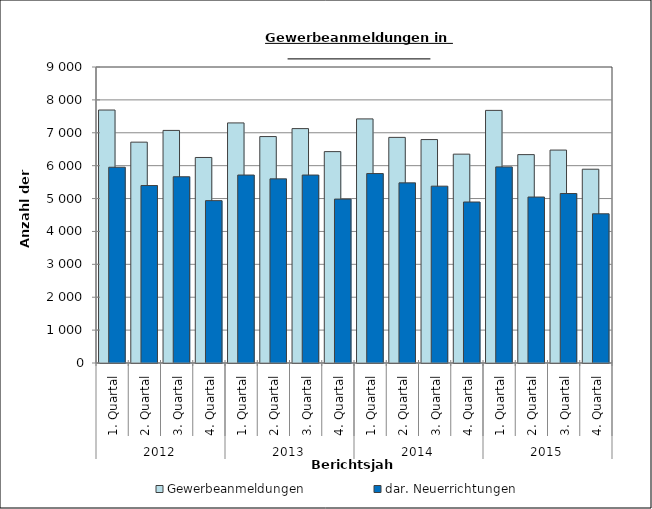
| Category | Gewerbeanmeldungen | dar. Neuerrichtungen |
|---|---|---|
| 0 | 7692 | 5952 |
| 1 | 6715 | 5396 |
| 2 | 7072 | 5663 |
| 3 | 6249 | 4937 |
| 4 | 7300 | 5715 |
| 5 | 6885 | 5599 |
| 6 | 7127 | 5715 |
| 7 | 6427 | 4984 |
| 8 | 7422 | 5760 |
| 9 | 6860 | 5477 |
| 10 | 6794 | 5377 |
| 11 | 6350 | 4895 |
| 12 | 7681 | 5962 |
| 13 | 6336 | 5046 |
| 14 | 6474 | 5153 |
| 15 | 5892 | 4537 |